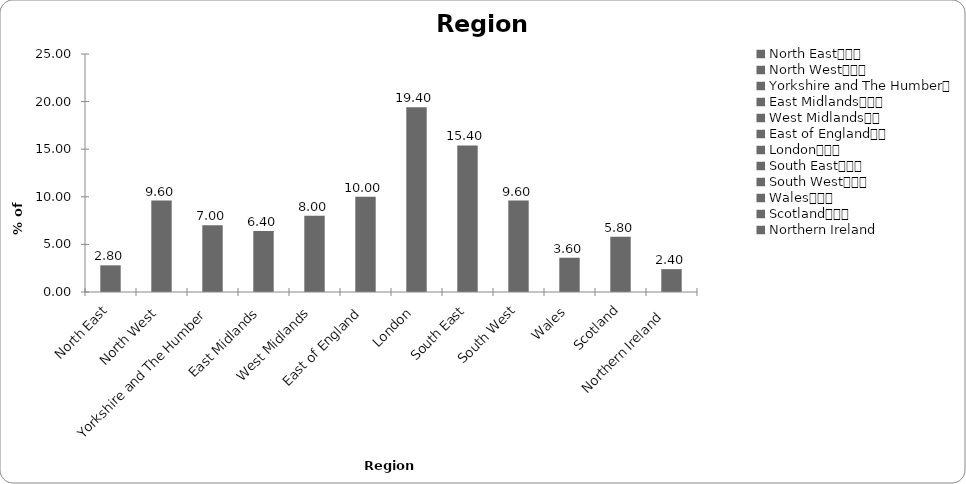
| Category | Region |
|---|---|
| North East			 | 2.8 |
| North West			 | 9.6 |
| Yorkshire and The Humber	 | 7 |
| East Midlands			 | 6.4 |
| West Midlands		 | 8 |
| East of England		 | 10 |
| London			 | 19.4 |
| South East			 | 15.4 |
| South West			 | 9.6 |
| Wales			 | 3.6 |
| Scotland			 | 5.8 |
| Northern Ireland  | 2.4 |